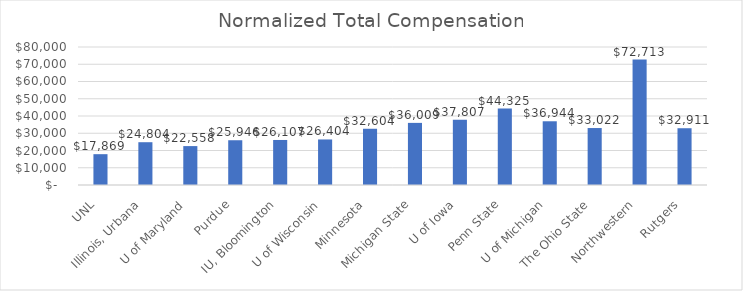
| Category | Series 0 |
|---|---|
|  UNL  | 17869.183 |
|  Illinois, Urbana  | 24804.496 |
|  U of Maryland  | 22558.48 |
|  Purdue  | 25946.057 |
|  IU, Bloomington  | 26106.561 |
|  U of Wisconsin  | 26403.881 |
|  Minnesota  | 32604.054 |
|  Michigan State  | 36009.209 |
|  U of Iowa  | 37806.841 |
|  Penn State  | 44325 |
|  U of Michigan  | 36943.964 |
|  The Ohio State  | 33022.024 |
|  Northwestern  | 72713.233 |
|  Rutgers  | 32910.782 |